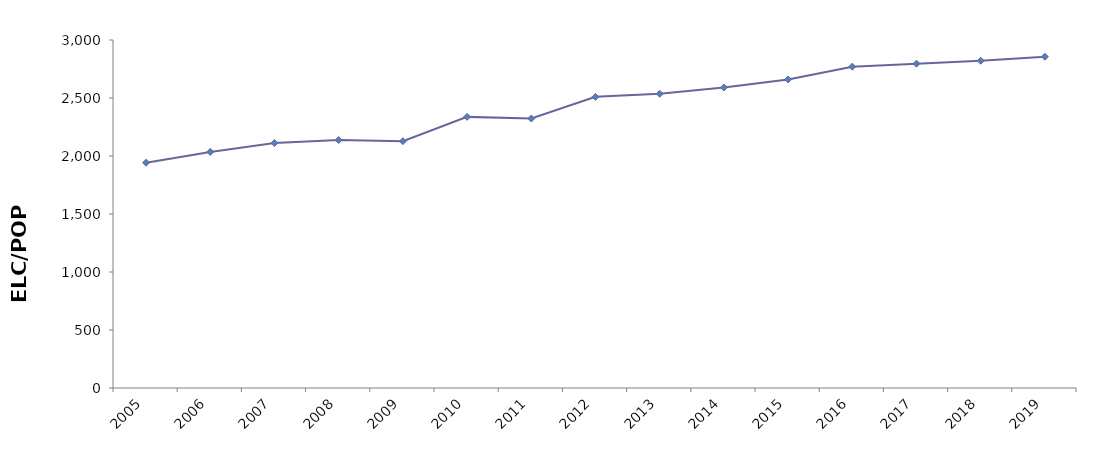
| Category | Electricity per Capita (KWh/Person) |
|---|---|
| 2005 | 1942.591 |
| 2006 | 2035.316 |
| 2007 | 2111.42 |
| 2008 | 2137.89 |
| 2009 | 2127.991 |
| 2010 | 2337.248 |
| 2011 | 2323.148 |
| 2012 | 2509.884 |
| 2013 | 2536.65 |
| 2014 | 2590.361 |
| 2015 | 2659.884 |
| 2016 | 2769.842 |
| 2017 | 2796.039 |
| 2018 | 2821.321 |
| 2019 | 2855.965 |